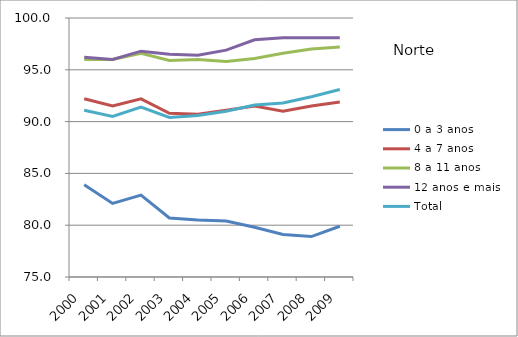
| Category | 0 a 3 anos | 4 a 7 anos | 8 a 11 anos | 12 anos e mais | Total |
|---|---|---|---|---|---|
| 2000.0 | 83.9 | 92.2 | 96 | 96.2 | 91.1 |
| 2001.0 | 82.1 | 91.5 | 96 | 96 | 90.5 |
| 2002.0 | 82.9 | 92.2 | 96.6 | 96.8 | 91.4 |
| 2003.0 | 80.7 | 90.8 | 95.9 | 96.5 | 90.4 |
| 2004.0 | 80.5 | 90.7 | 96 | 96.4 | 90.6 |
| 2005.0 | 80.4 | 91.1 | 95.8 | 96.9 | 91 |
| 2006.0 | 79.8 | 91.5 | 96.1 | 97.9 | 91.6 |
| 2007.0 | 79.1 | 91 | 96.6 | 98.1 | 91.8 |
| 2008.0 | 78.9 | 91.5 | 97 | 98.1 | 92.4 |
| 2009.0 | 79.9 | 91.9 | 97.2 | 98.1 | 93.1 |